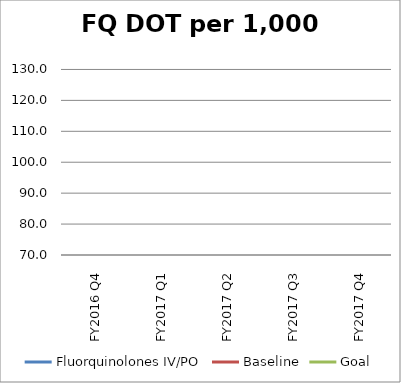
| Category | Fluorquinolones IV/PO | Baseline | Goal |
|---|---|---|---|
| FY2016 Q4 | 0 |  |  |
| FY2017 Q1 | 0 |  |  |
| FY2017 Q2 | 0 |  |  |
| FY2017 Q3 | 0 |  |  |
| FY2017 Q4 | 0 |  |  |